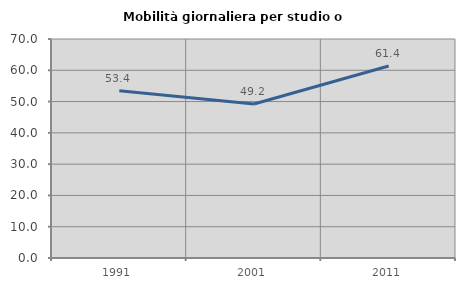
| Category | Mobilità giornaliera per studio o lavoro |
|---|---|
| 1991.0 | 53.435 |
| 2001.0 | 49.231 |
| 2011.0 | 61.358 |